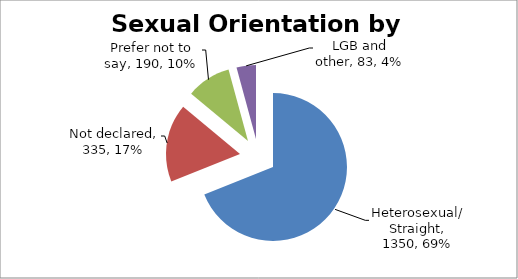
| Category | Series 0 |
|---|---|
| Heterosexual/Straight | 1350 |
| Not declared | 335 |
| Prefer not to say | 190 |
| LGB and other | 83 |